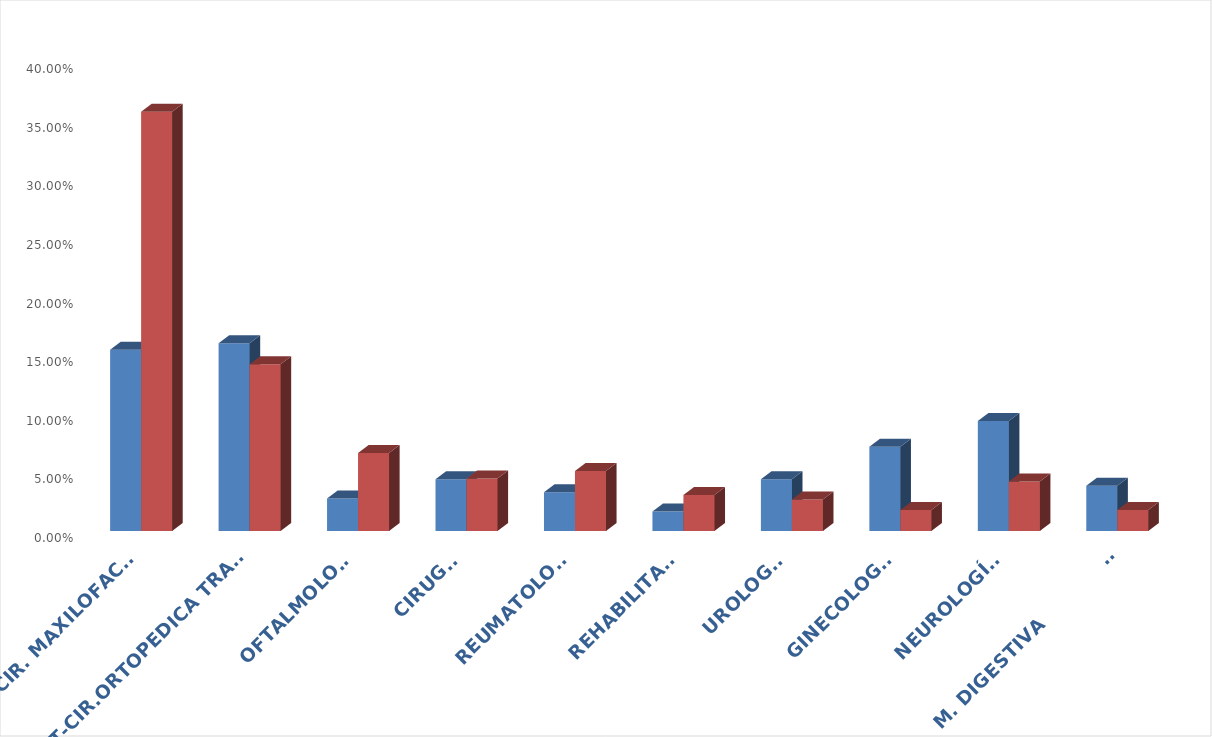
| Category | Series 0 | Series 1 |
|---|---|---|
| CIR. MAXILOFACIAL | 0.155 | 0.358 |
| COT-CIR.ORTOPEDICA TRAUMA | 0.16 | 0.142 |
| OFTALMOLOGIA | 0.028 | 0.067 |
| CIRUGIA | 0.044 | 0.045 |
| REUMATOLOGIA | 0.033 | 0.051 |
| REHABILITACIÓ | 0.017 | 0.031 |
| UROLOGÍA | 0.044 | 0.027 |
| GINECOLOGÍA | 0.072 | 0.018 |
| NEUROLOGÍA  | 0.094 | 0.042 |
| M. DIGESTIVA                  | 0.039 | 0.018 |